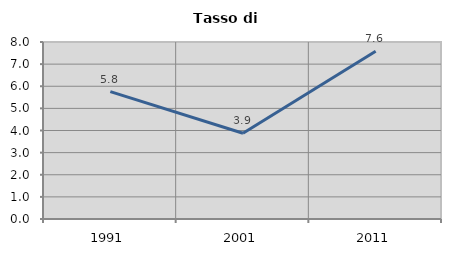
| Category | Tasso di disoccupazione   |
|---|---|
| 1991.0 | 5.757 |
| 2001.0 | 3.876 |
| 2011.0 | 7.581 |